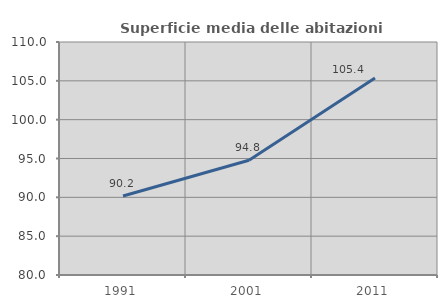
| Category | Superficie media delle abitazioni occupate |
|---|---|
| 1991.0 | 90.165 |
| 2001.0 | 94.768 |
| 2011.0 | 105.38 |